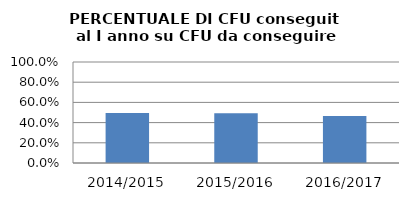
| Category | 2014/2015 2015/2016 2016/2017 |
|---|---|
| 2014/2015 | 0.495 |
| 2015/2016 | 0.493 |
| 2016/2017 | 0.466 |